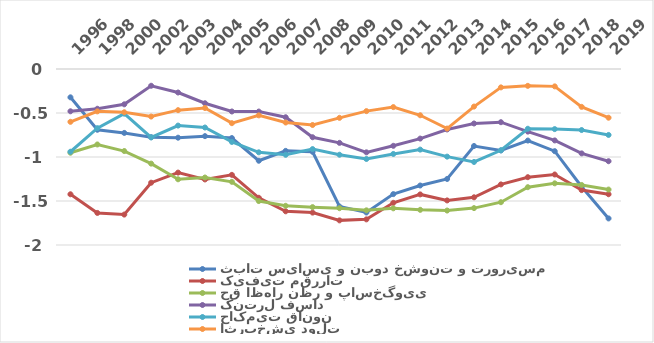
| Category | ثبات سیاسی و نبود خشونت و تروریسم | کیفیت مقررات | حق اظهار نظر و پاسخگویی | کنترل فساد | حاکمیت قانون | اثربخشی دولت |
|---|---|---|---|---|---|---|
| 1996.0 | -0.322 | -1.424 | -0.951 | -0.481 | -0.94 | -0.6 |
| 1998.0 | -0.69 | -1.636 | -0.858 | -0.452 | -0.672 | -0.482 |
| 2000.0 | -0.726 | -1.654 | -0.932 | -0.401 | -0.508 | -0.492 |
| 2002.0 | -0.775 | -1.292 | -1.075 | -0.191 | -0.778 | -0.54 |
| 2003.0 | -0.781 | -1.177 | -1.253 | -0.267 | -0.643 | -0.468 |
| 2004.0 | -0.763 | -1.255 | -1.233 | -0.389 | -0.665 | -0.443 |
| 2005.0 | -0.785 | -1.203 | -1.282 | -0.483 | -0.829 | -0.616 |
| 2006.0 | -1.043 | -1.463 | -1.501 | -0.484 | -0.947 | -0.527 |
| 2007.0 | -0.93 | -1.617 | -1.554 | -0.548 | -0.975 | -0.608 |
| 2008.0 | -0.941 | -1.632 | -1.57 | -0.775 | -0.91 | -0.636 |
| 2009.0 | -1.563 | -1.72 | -1.582 | -0.839 | -0.974 | -0.555 |
| 2010.0 | -1.631 | -1.709 | -1.606 | -0.947 | -1.022 | -0.479 |
| 2011.0 | -1.422 | -1.521 | -1.583 | -0.873 | -0.965 | -0.433 |
| 2012.0 | -1.324 | -1.425 | -1.6 | -0.791 | -0.916 | -0.526 |
| 2013.0 | -1.25 | -1.493 | -1.608 | -0.687 | -0.996 | -0.677 |
| 2014.0 | -0.875 | -1.458 | -1.581 | -0.619 | -1.056 | -0.427 |
| 2015.0 | -0.926 | -1.312 | -1.514 | -0.605 | -0.923 | -0.209 |
| 2016.0 | -0.813 | -1.229 | -1.343 | -0.711 | -0.679 | -0.191 |
| 2017.0 | -0.934 | -1.199 | -1.299 | -0.812 | -0.683 | -0.197 |
| 2018.0 | -1.338 | -1.376 | -1.318 | -0.959 | -0.694 | -0.43 |
| 2019.0 | -1.698 | -1.423 | -1.37 | -1.048 | -0.749 | -0.554 |